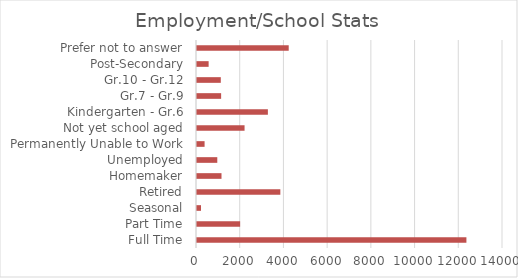
| Category | Series 1 |
|---|---|
| Full Time | 12326 |
| Part Time | 1973 |
| Seasonal | 184 |
| Retired | 3813 |
| Homemaker | 1121 |
| Unemployed | 928 |
| Permanently Unable to Work | 347 |
| Not yet school aged | 2176 |
| Kindergarten - Gr.6 | 3243 |
| Gr.7 - Gr.9 | 1104 |
| Gr.10 - Gr.12 | 1089 |
| Post-Secondary | 532 |
| Prefer not to answer | 4196 |